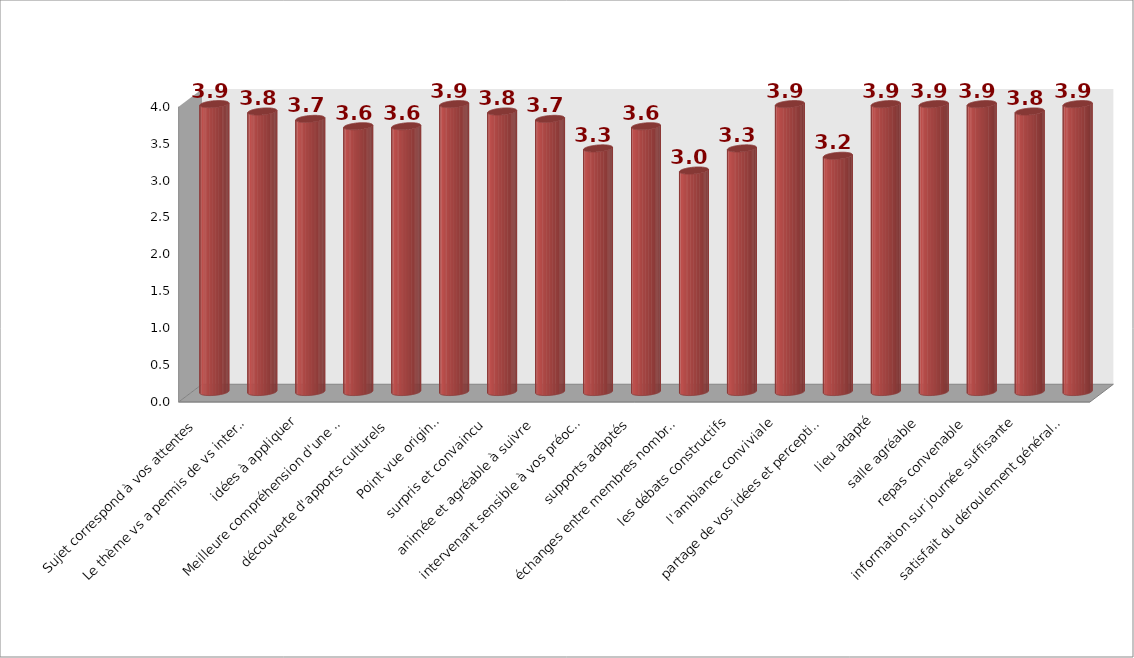
| Category | Series 1 |
|---|---|
| Sujet correspond à vos attentes | 3.9 |
| Le thème vs a permis de vs interroger sur vs mm | 3.8 |
| idées à appliquer | 3.7 |
| Meilleure compréhension d'une clé managériale | 3.6 |
| découverte d'apports culturels | 3.6 |
| Point vue original | 3.9 |
| surpris et convaincu | 3.8 |
| animée et agréable à suivre | 3.7 |
| intervenant sensible à vos préoccupations | 3.3 |
| supports adaptés | 3.6 |
| échanges entre membres nombreux | 3 |
| les débats constructifs | 3.3 |
| l'ambiance conviviale | 3.9 |
| partage de vos idées et perceptions | 3.2 |
| lieu adapté | 3.9 |
| salle agréable | 3.9 |
| repas convenable | 3.9 |
| information sur journée suffisante | 3.8 |
| satisfait du déroulement général réunion | 3.9 |